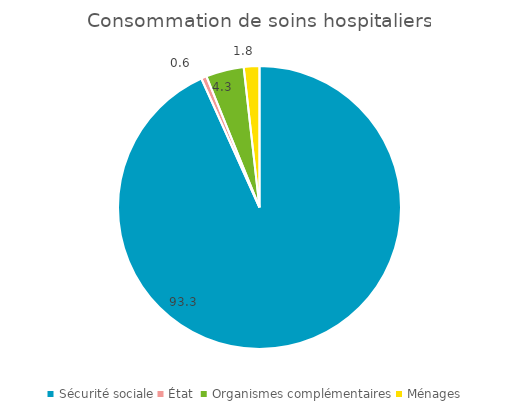
| Category | Consommation de soins hospitaliers |
|---|---|
| Sécurité sociale | 93.258 |
| État  | 0.619 |
| Organismes complémentaires | 4.334 |
| Ménages | 1.788 |